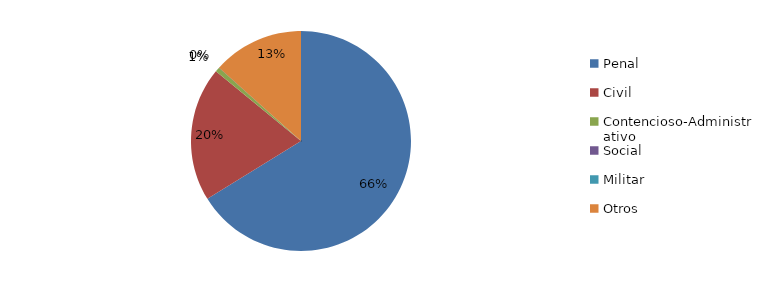
| Category | Series 0 |
|---|---|
| Penal | 94 |
| Civil | 28 |
| Contencioso-Administrativo | 1 |
| Social | 0 |
| Militar | 0 |
| Otros | 19 |